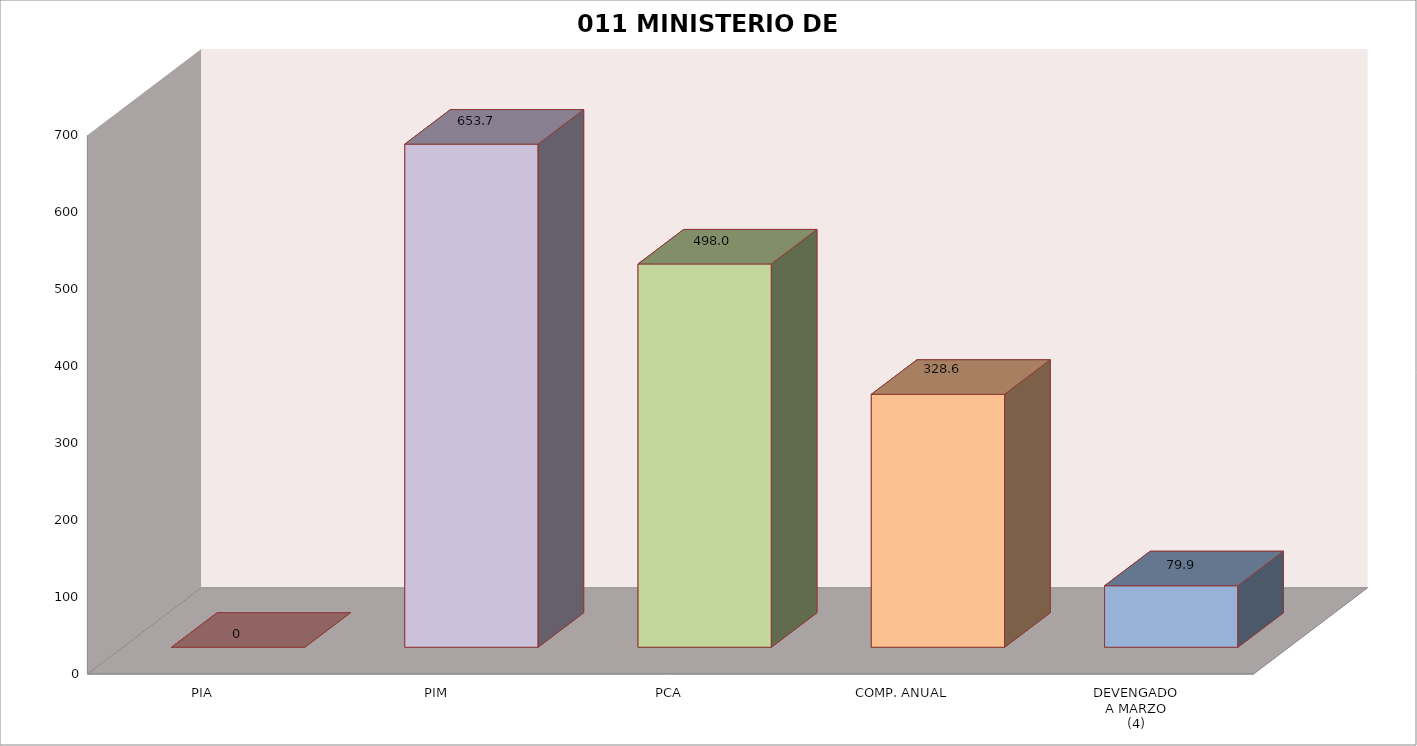
| Category | 011 MINISTERIO DE SALUD |
|---|---|
| PIA | 0 |
| PIM | 653.699 |
| PCA | 498.017 |
| COMP. ANUAL | 328.65 |
| DEVENGADO
A MARZO
(4) | 79.913 |